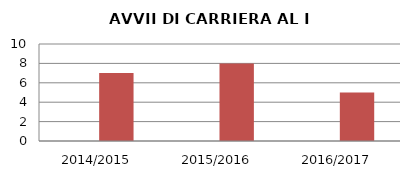
| Category | ANNO | NUMERO |
|---|---|---|
| 2014/2015 | 0 | 7 |
| 2015/2016 | 0 | 8 |
| 2016/2017 | 0 | 5 |